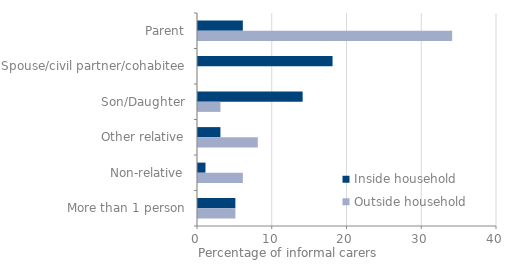
| Category | Inside household | Outside household |
|---|---|---|
| 0 | 6 | 34 |
| 1 | 18 | 0 |
| 2 | 14 | 3 |
| 3 | 3 | 8 |
| 4 | 1 | 6 |
| 5 | 5 | 5 |